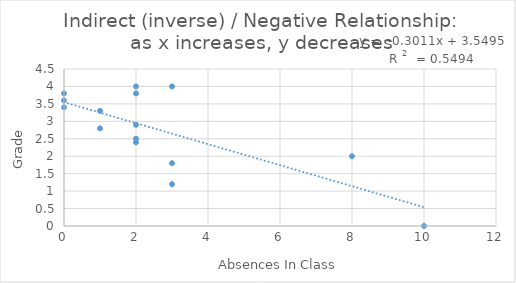
| Category | Grade |
|---|---|
| 2.0 | 2.9 |
| 3.0 | 4 |
| 8.0 | 2 |
| 2.0 | 2.5 |
| 0.0 | 3.8 |
| 1.0 | 3.3 |
| 3.0 | 1.8 |
| 3.0 | 1.2 |
| 2.0 | 2.4 |
| 1.0 | 2.8 |
| 10.0 | 0 |
| 0.0 | 3.4 |
| 2.0 | 4 |
| 0.0 | 3.6 |
| 2.0 | 3.8 |